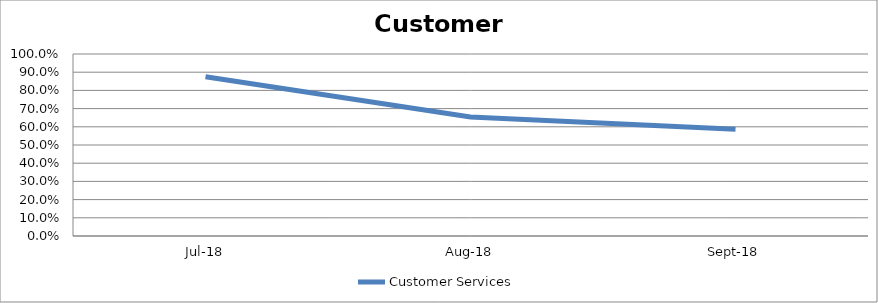
| Category | Customer Services |
|---|---|
| 2018-07-01 | 0.875 |
| 2018-08-01 | 0.654 |
| 2018-09-01 | 0.586 |